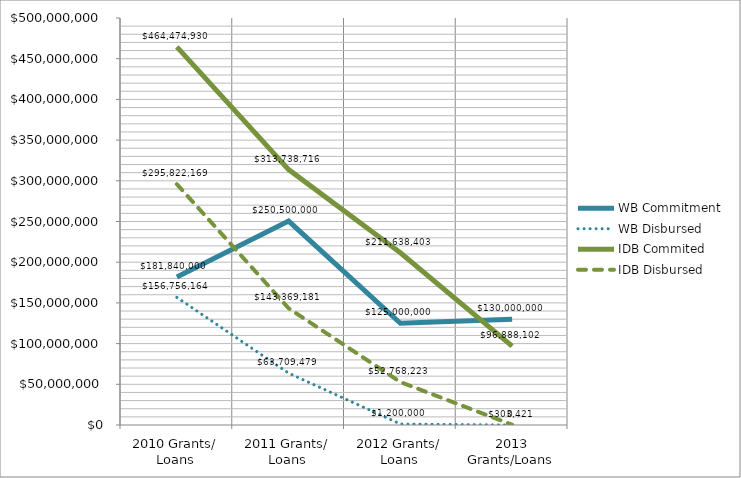
| Category | WB Commitment | WB Disbursed | IDB Commited | IDB Disbursed |
|---|---|---|---|---|
| 2010 Grants/ Loans | 181840000 | 156756163.62 | 464474930 | 295822169 |
| 2011 Grants/ Loans | 250500000 | 63709478.5 | 313738716 | 143369181 |
| 2012 Grants/ Loans | 125000000 | 1200000 | 211638403 | 52768223 |
| 2013 Grants/Loans | 130000000 | 0 | 96888102 | 303421 |